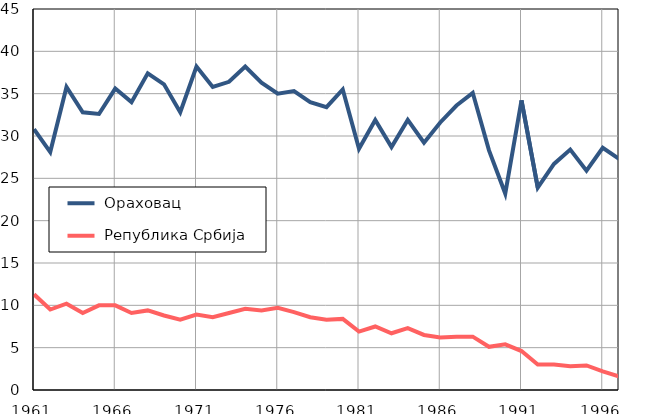
| Category |  Ораховац |  Република Србија |
|---|---|---|
| 1961.0 | 30.8 | 11.3 |
| 1962.0 | 28.1 | 9.5 |
| 1963.0 | 35.8 | 10.2 |
| 1964.0 | 32.8 | 9.1 |
| 1965.0 | 32.6 | 10 |
| 1966.0 | 35.6 | 10 |
| 1967.0 | 34 | 9.1 |
| 1968.0 | 37.4 | 9.4 |
| 1969.0 | 36.1 | 8.8 |
| 1970.0 | 32.8 | 8.3 |
| 1971.0 | 38.2 | 8.9 |
| 1972.0 | 35.8 | 8.6 |
| 1973.0 | 36.4 | 9.1 |
| 1974.0 | 38.2 | 9.6 |
| 1975.0 | 36.3 | 9.4 |
| 1976.0 | 35 | 9.7 |
| 1977.0 | 35.3 | 9.2 |
| 1978.0 | 34 | 8.6 |
| 1979.0 | 33.4 | 8.3 |
| 1980.0 | 35.5 | 8.4 |
| 1981.0 | 28.5 | 6.9 |
| 1982.0 | 31.9 | 7.5 |
| 1983.0 | 28.7 | 6.7 |
| 1984.0 | 31.9 | 7.3 |
| 1985.0 | 29.2 | 6.5 |
| 1986.0 | 31.6 | 6.2 |
| 1987.0 | 33.6 | 6.3 |
| 1988.0 | 35.1 | 6.3 |
| 1989.0 | 28.3 | 5.1 |
| 1990.0 | 23.2 | 5.4 |
| 1991.0 | 34.2 | 4.6 |
| 1992.0 | 23.9 | 3 |
| 1993.0 | 26.7 | 3 |
| 1994.0 | 28.4 | 2.8 |
| 1995.0 | 25.9 | 2.9 |
| 1996.0 | 28.6 | 2.2 |
| 1997.0 | 27.3 | 1.6 |